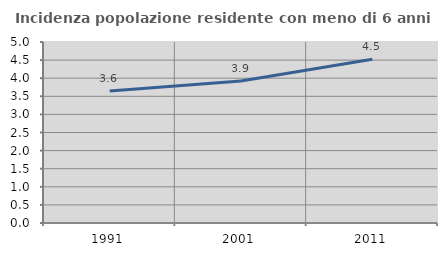
| Category | Incidenza popolazione residente con meno di 6 anni |
|---|---|
| 1991.0 | 3.65 |
| 2001.0 | 3.925 |
| 2011.0 | 4.524 |